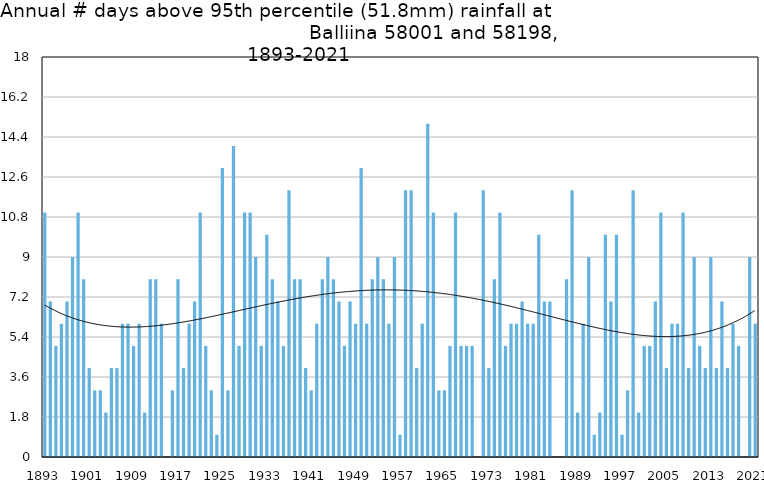
| Category | Annual # days above 95th percentile |
|---|---|
| 1893 | 11 |
| 1894 | 7 |
| 1895 | 5 |
| 1896 | 6 |
| 1897 | 7 |
| 1898 | 9 |
| 1899 | 11 |
| 1900 | 8 |
| 1901 | 4 |
| 1902 | 3 |
| 1903 | 3 |
| 1904 | 2 |
| 1905 | 4 |
| 1906 | 4 |
| 1907 | 6 |
| 1908 | 6 |
| 1909 | 5 |
| 1910 | 6 |
| 1911 | 2 |
| 1912 | 8 |
| 1913 | 8 |
| 1914 | 6 |
| 1915 | 0 |
| 1916 | 3 |
| 1917 | 8 |
| 1918 | 4 |
| 1919 | 6 |
| 1920 | 7 |
| 1921 | 11 |
| 1922 | 5 |
| 1923 | 3 |
| 1924 | 1 |
| 1925 | 13 |
| 1926 | 3 |
| 1927 | 14 |
| 1928 | 5 |
| 1929 | 11 |
| 1930 | 11 |
| 1931 | 9 |
| 1932 | 5 |
| 1933 | 10 |
| 1934 | 8 |
| 1935 | 7 |
| 1936 | 5 |
| 1937 | 12 |
| 1938 | 8 |
| 1939 | 8 |
| 1940 | 4 |
| 1941 | 3 |
| 1942 | 6 |
| 1943 | 8 |
| 1944 | 9 |
| 1945 | 8 |
| 1946 | 7 |
| 1947 | 5 |
| 1948 | 7 |
| 1949 | 6 |
| 1950 | 13 |
| 1951 | 6 |
| 1952 | 8 |
| 1953 | 9 |
| 1954 | 8 |
| 1955 | 6 |
| 1956 | 9 |
| 1957 | 1 |
| 1958 | 12 |
| 1959 | 12 |
| 1960 | 4 |
| 1961 | 6 |
| 1962 | 15 |
| 1963 | 11 |
| 1964 | 3 |
| 1965 | 3 |
| 1966 | 5 |
| 1967 | 11 |
| 1968 | 5 |
| 1969 | 5 |
| 1970 | 5 |
| 1971 | 0 |
| 1972 | 12 |
| 1973 | 4 |
| 1974 | 8 |
| 1975 | 11 |
| 1976 | 5 |
| 1977 | 6 |
| 1978 | 6 |
| 1979 | 7 |
| 1980 | 6 |
| 1981 | 6 |
| 1982 | 10 |
| 1983 | 7 |
| 1984 | 7 |
| 1985 | 0 |
| 1986 | 0 |
| 1987 | 8 |
| 1988 | 12 |
| 1989 | 2 |
| 1990 | 6 |
| 1991 | 9 |
| 1992 | 1 |
| 1993 | 2 |
| 1994 | 10 |
| 1995 | 7 |
| 1996 | 10 |
| 1997 | 1 |
| 1998 | 3 |
| 1999 | 12 |
| 2000 | 2 |
| 2001 | 5 |
| 2002 | 5 |
| 2003 | 7 |
| 2004 | 11 |
| 2005 | 4 |
| 2006 | 6 |
| 2007 | 6 |
| 2008 | 11 |
| 2009 | 4 |
| 2010 | 9 |
| 2011 | 5 |
| 2012 | 4 |
| 2013 | 9 |
| 2014 | 4 |
| 2015 | 7 |
| 2016 | 4 |
| 2017 | 6 |
| 2018 | 5 |
| 2019 | 0 |
| 2020 | 9 |
| 2021 | 6 |